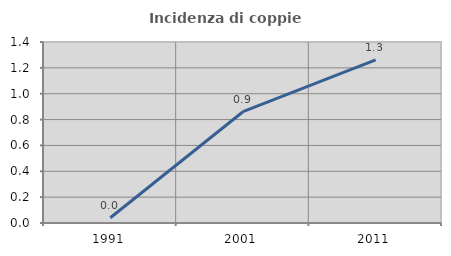
| Category | Incidenza di coppie miste |
|---|---|
| 1991.0 | 0.041 |
| 2001.0 | 0.861 |
| 2011.0 | 1.261 |